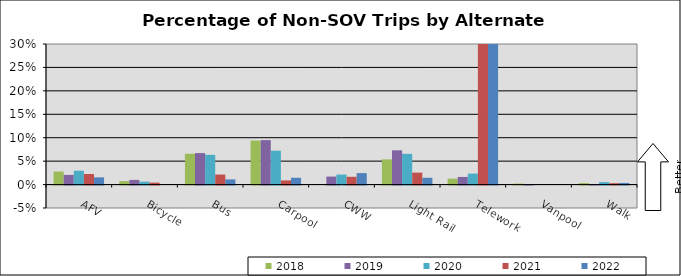
| Category | 2018 | 2019 | 2020 | 2021 | 2022 |
|---|---|---|---|---|---|
| AFV | 0.028 | 0.021 | 0.03 | 0.023 | 0.015 |
| Bicycle | 0.007 | 0.01 | 0.006 | 0.004 | 0 |
| Bus | 0.066 | 0.067 | 0.063 | 0.021 | 0.011 |
| Carpool | 0.094 | 0.095 | 0.072 | 0.009 | 0.014 |
| CWW | 0 | 0.017 | 0.021 | 0.017 | 0.024 |
| Light Rail | 0.054 | 0.073 | 0.066 | 0.026 | 0.014 |
| Telework | 0.013 | 0.016 | 0.023 | 0.542 | 0.468 |
| Vanpool | 0.002 | 0 | 0 | 0 | 0 |
| Walk | 0.003 | 0 | 0.005 | 0.003 | 0.003 |